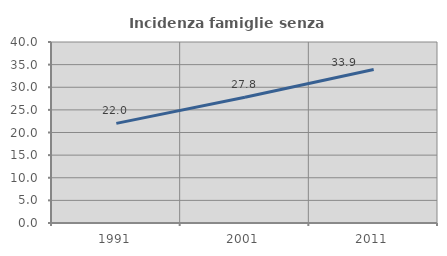
| Category | Incidenza famiglie senza nuclei |
|---|---|
| 1991.0 | 22.022 |
| 2001.0 | 27.798 |
| 2011.0 | 33.919 |